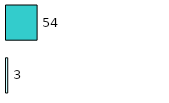
| Category | Series 0 | Series 1 |
|---|---|---|
| 0 | 3 | 54 |